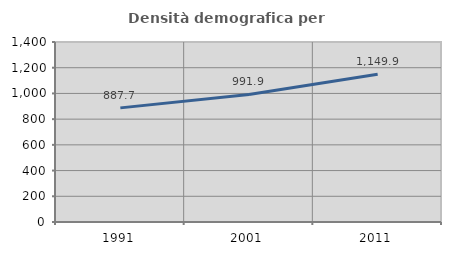
| Category | Densità demografica |
|---|---|
| 1991.0 | 887.671 |
| 2001.0 | 991.857 |
| 2011.0 | 1149.901 |